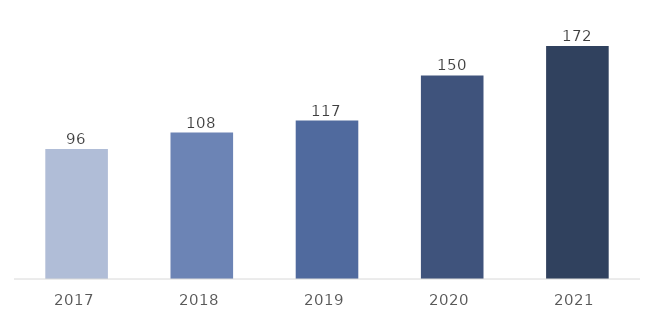
| Category | Totale |
|---|---|
| 2017 | 95.908 |
| 2018 | 108.106 |
| 2019 | 116.953 |
| 2020 | 150.225 |
| 2021 | 171.922 |